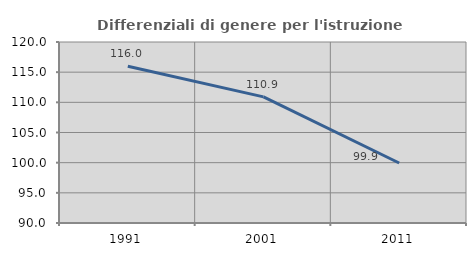
| Category | Differenziali di genere per l'istruzione superiore |
|---|---|
| 1991.0 | 115.971 |
| 2001.0 | 110.9 |
| 2011.0 | 99.944 |